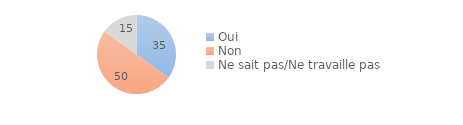
| Category | Series 0 |
|---|---|
| Oui | 34.83 |
| Non | 50.237 |
| Ne sait pas/Ne travaille pas | 14.933 |